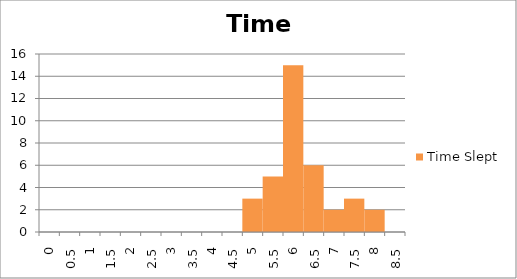
| Category | Time Slept |
|---|---|
| 0.0 | 0 |
| 0.5 | 0 |
| 1.0 | 0 |
| 1.5 | 0 |
| 2.0 | 0 |
| 2.5 | 0 |
| 3.0 | 0 |
| 3.5 | 0 |
| 4.0 | 0 |
| 4.5 | 0 |
| 5.0 | 3 |
| 5.5 | 5 |
| 6.0 | 15 |
| 6.5 | 6 |
| 7.0 | 2 |
| 7.5 | 3 |
| 8.0 | 2 |
| 8.5 | 0 |